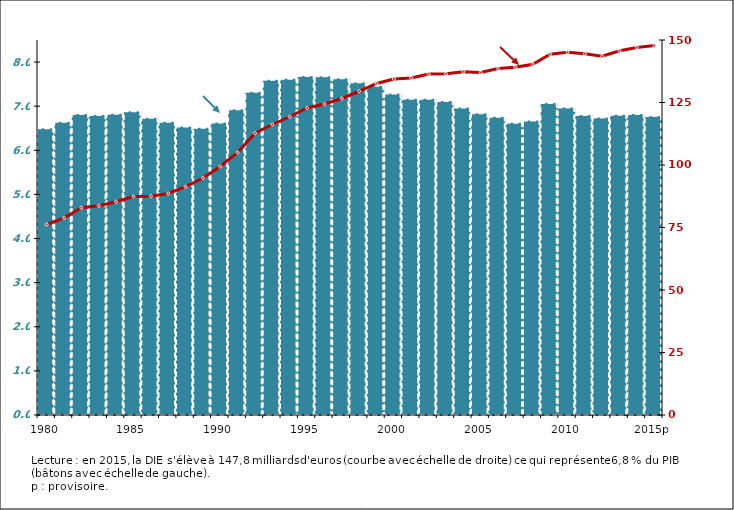
| Category | DIE/PIB |
|---|---|
| 1980 | 6.497 |
| 1981 | 6.646 |
| 1982 | 6.824 |
| 1983 | 6.803 |
| 1984 | 6.829 |
| 1985 | 6.884 |
| 1986 | 6.736 |
| 1987 | 6.648 |
| 1988 | 6.537 |
| 1989 | 6.509 |
| 1990 | 6.629 |
| 1991 | 6.932 |
| 1992 | 7.326 |
| 1993 | 7.597 |
| 1994 | 7.623 |
| 1995 | 7.686 |
| 1996 | 7.677 |
| 1997 | 7.633 |
| 1998 | 7.54 |
| 1999 | 7.465 |
| 2000 | 7.285 |
| 2001 | 7.168 |
| 2002 | 7.171 |
| 2003 | 7.119 |
| 2004 | 6.968 |
| 2005 | 6.842 |
| 2006 | 6.761 |
| 2007 | 6.627 |
| 2008 | 6.673 |
| 2009 | 7.072 |
| 2010 | 6.972 |
| 2011 | 6.803 |
| 2012 | 6.746 |
| 2013 | 6.808 |
| 2014 | 6.825 |
| 2015p | 6.775 |